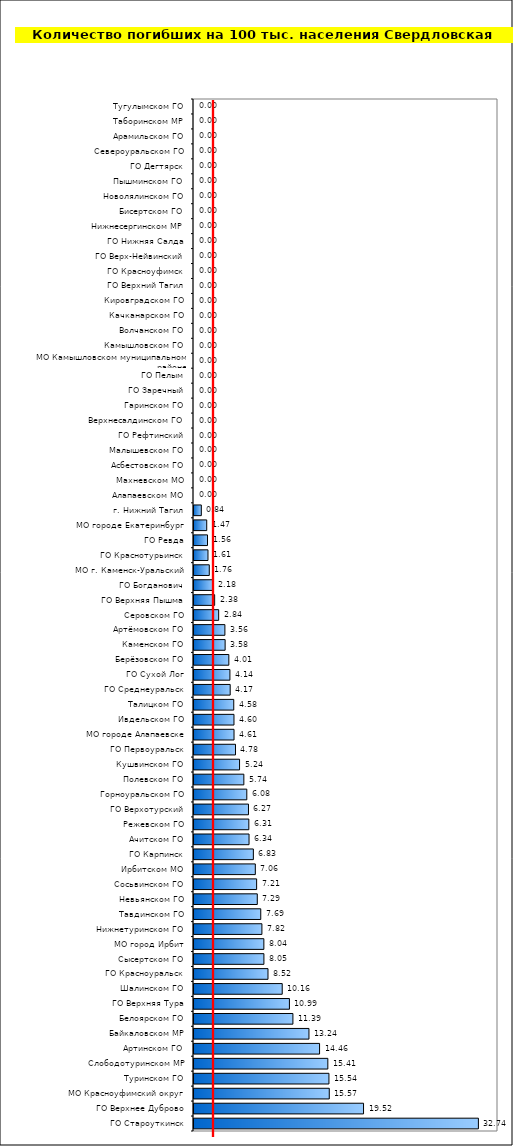
| Category | Series 0 |
|---|---|
| ГО Староуткинск | 32.744 |
| ГО Верхнее Дуброво | 19.52 |
| МО Красноуфимский округ | 15.572 |
| Туринском ГО | 15.537 |
| Слободотуринском МР | 15.41 |
| Артинском ГО | 14.458 |
| Байкаловском МР | 13.236 |
| Белоярском ГО | 11.388 |
| ГО Верхняя Тура | 10.985 |
| Шалинском ГО | 10.155 |
| ГО Красноуральск | 8.52 |
| Сысертском ГО | 8.049 |
| МО город Ирбит | 8.044 |
| Нижнетуринском ГО | 7.818 |
| Тавдинском ГО | 7.686 |
| Невьянском ГО | 7.285 |
| Сосьвинском ГО | 7.211 |
| Ирбитском МО | 7.059 |
| ГО Карпинск | 6.832 |
| Ачитском ГО | 6.337 |
| Режевском ГО | 6.314 |
| ГО Верхотурский | 6.272 |
| Горноуральском ГО | 6.08 |
| Полевском ГО | 5.739 |
| Кушвинском ГО | 5.245 |
| ГО Первоуральск | 4.777 |
| МО городе Алапаевске | 4.609 |
| Ивдельском ГО | 4.602 |
| Талицком ГО | 4.577 |
| ГО Среднеуральск | 4.166 |
| ГО Сухой Лог | 4.135 |
| Берёзовском ГО | 4.011 |
| Каменском ГО | 3.582 |
| Артёмовском ГО | 3.557 |
| Серовском ГО | 2.839 |
| ГО Верхняя Пышма | 2.378 |
| ГО Богданович | 2.18 |
| МО г. Каменск-Уральский | 1.756 |
| ГО Краснотурьинск | 1.61 |
| ГО Ревда | 1.555 |
| МО городе Екатеринбург | 1.465 |
| г. Нижний Тагил | 0.841 |
| Алапаевском МО | 0 |
| Махневском МО | 0 |
| Асбестовском ГО | 0 |
| Малышевском ГО | 0 |
| ГО Рефтинский | 0 |
| Верхнесалдинском ГО | 0 |
| Гаринском ГО | 0 |
| ГО Заречный | 0 |
| ГО Пелым | 0 |
| МО Камышловском муниципальном районе | 0 |
| Камышловском ГО | 0 |
| Волчанском ГО | 0 |
| Качканарском ГО | 0 |
| Кировградском ГО | 0 |
| ГО Верхний Тагил | 0 |
| ГО Красноуфимск | 0 |
| ГО Верх-Нейвинский | 0 |
| ГО Нижняя Салда | 0 |
| Нижнесергинском МР | 0 |
| Бисертском ГО | 0 |
| Новолялинском ГО | 0 |
| Пышминском ГО | 0 |
| ГО Дегтярск | 0 |
| Североуральском ГО | 0 |
| Арамильском ГО | 0 |
| Таборинском МР | 0 |
| Тугулымском ГО | 0 |